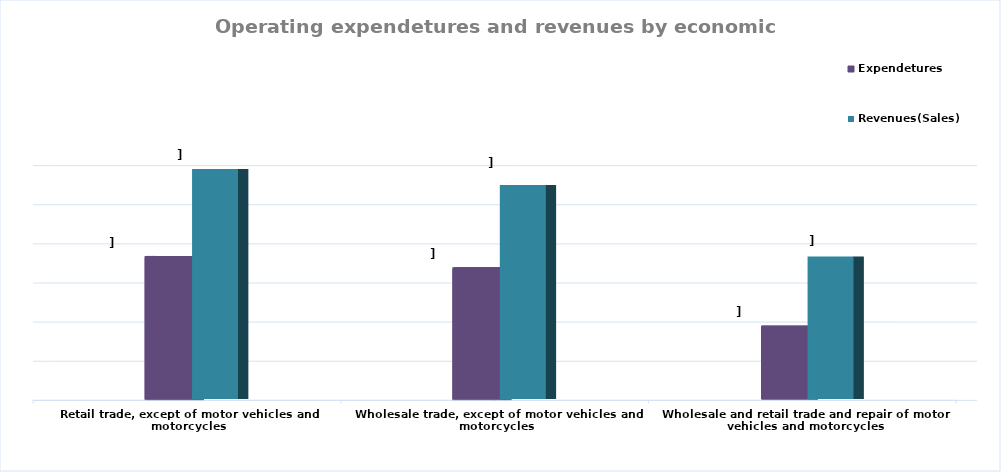
| Category | Expendetures | Revenues(Sales) |
|---|---|---|
| Wholesale and retail trade and repair of motor vehicles and motorcycles | 18615917843.003 | 36397268531.698 |
| Wholesale trade, except of motor vehicles and motorcycles | 33299483788.135 | 54723284506.779 |
| Retail trade, except of motor vehicles and motorcycles | 36193937211.252 | 58792199104.654 |